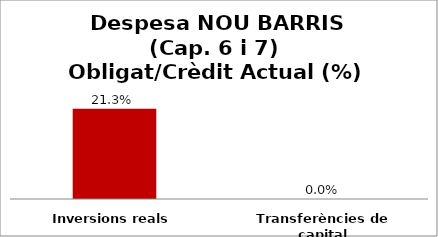
| Category | Series 0 |
|---|---|
| Inversions reals | 0.213 |
| Transferències de capital | 0 |